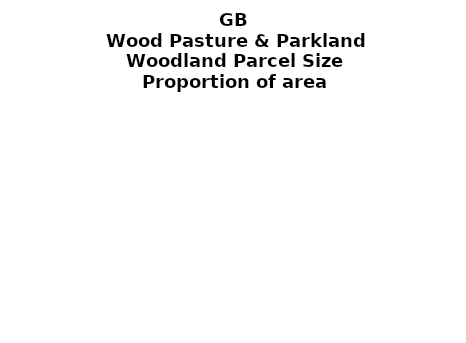
| Category | Wood Pasture & Parkland |
|---|---|
| <5 ha | 0.363 |
| ≥5 and <10 ha | 0.061 |
| ≥10 and <15 ha | 0.048 |
| ≥15 and <20 ha | 0.016 |
| ≥20 and <25 ha | 0.004 |
| ≥25 and <30 ha | 0.006 |
| ≥30 and <35 ha | 0.021 |
| ≥35 and <40 ha | 0 |
| ≥40 and <45 ha | 0.01 |
| ≥45 and <50 ha | 0 |
| ≥50 and <60 ha | 0.011 |
| ≥60 and <70 ha | 0.021 |
| ≥70 and <80 ha | 0.042 |
| ≥80 and <90 ha | 0.01 |
| ≥90 and <100 ha | 0.005 |
| ≥100 and <150 ha | 0.108 |
| ≥150 and <200 ha | 0.026 |
| ≥200 ha | 0.247 |